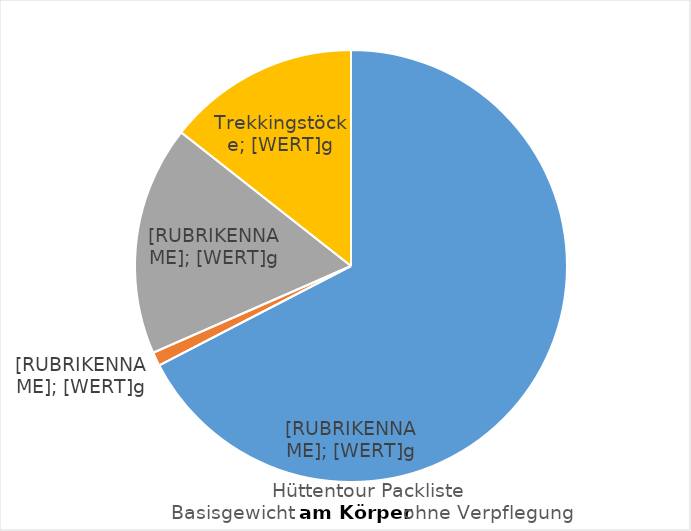
| Category | Series 0 |
|---|---|
| Kleidung | 1639 |
| Dokumente | 25 |
| Elektronik | 418 |
| Sonstiges | 350 |